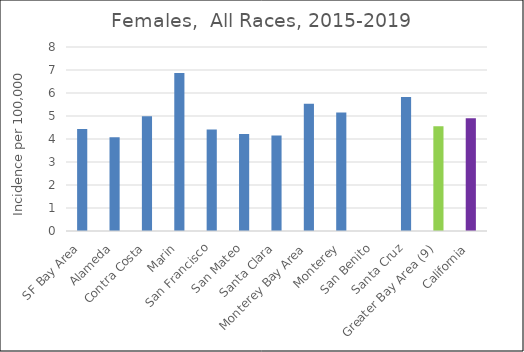
| Category | Female |
|---|---|
| SF Bay Area | 4.43 |
|   Alameda | 4.08 |
|   Contra Costa | 4.99 |
|   Marin | 6.87 |
|   San Francisco | 4.41 |
|   San Mateo | 4.22 |
|   Santa Clara | 4.15 |
| Monterey Bay Area | 5.53 |
|   Monterey | 5.15 |
|   San Benito | 0 |
|   Santa Cruz | 5.83 |
| Greater Bay Area (9) | 4.55 |
| California | 4.9 |